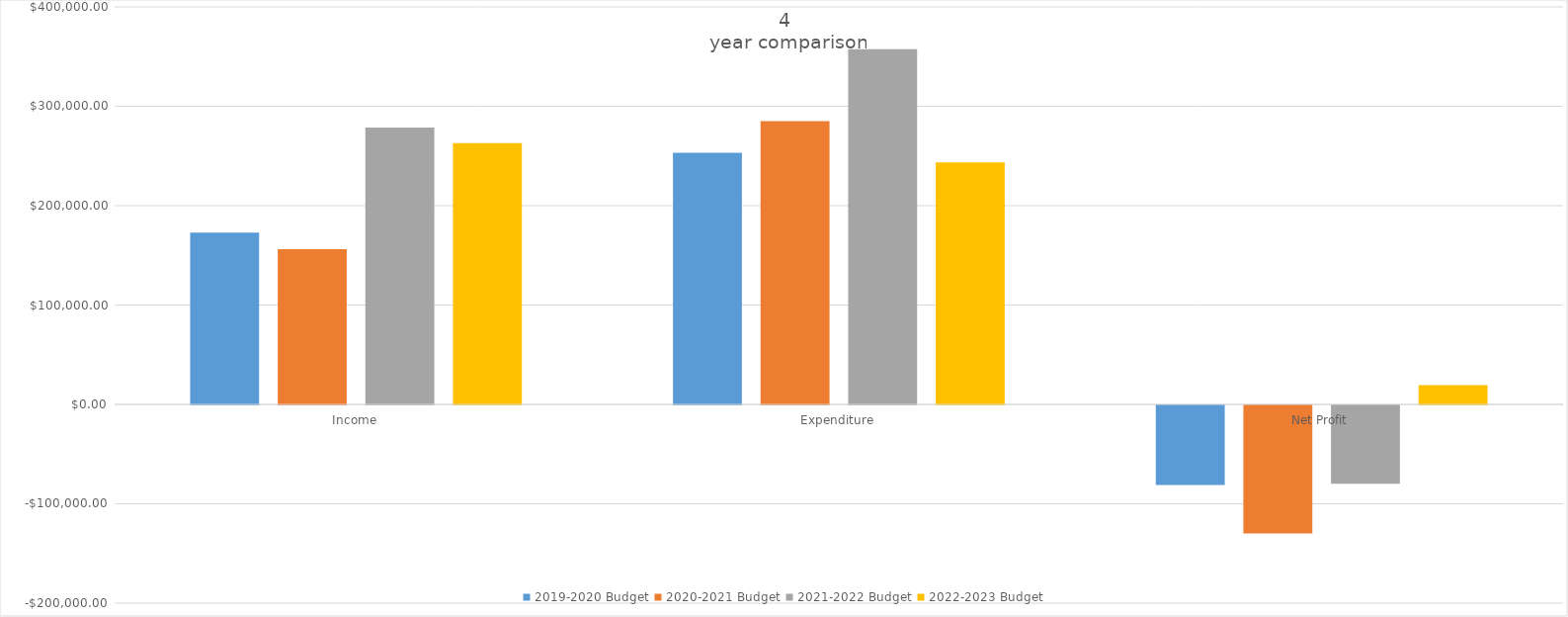
| Category | 2019-2020 Budget | 2020-2021 Budget | 2021-2022 Budget | 2022-2023 Budget |
|---|---|---|---|---|
| Income | 172947 | 156124 | 278551 | 262853 |
| Expenditure | 253150 | 285009.7 | 357452 | 243564 |
| Net Profit | -80203 | -128884.7 | -78901 | 19289 |